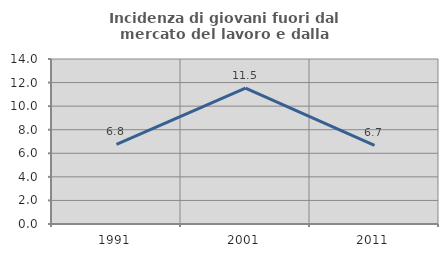
| Category | Incidenza di giovani fuori dal mercato del lavoro e dalla formazione  |
|---|---|
| 1991.0 | 6.757 |
| 2001.0 | 11.538 |
| 2011.0 | 6.667 |